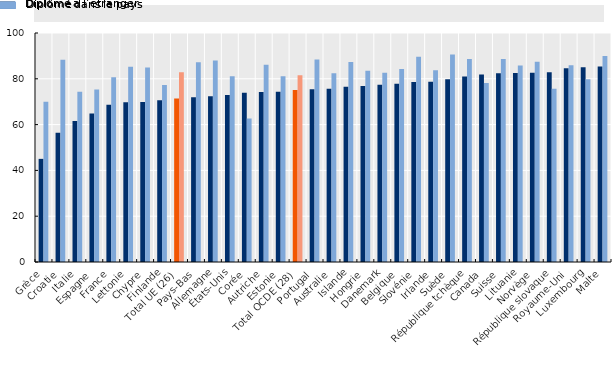
| Category | Diplômé à l’étranger | Diplômé dans le pays |
|---|---|---|
| Grèce | 45.035 | 69.969 |
| Croatie | 56.391 | 88.297 |
| Italie | 61.547 | 74.314 |
| Espagne | 64.878 | 75.319 |
| France | 68.668 | 80.681 |
| Lettonie | 69.769 | 85.293 |
| Chypre | 69.894 | 84.911 |
| Finlande | 70.635 | 77.281 |
| Total UE (26) | 71.386 | 82.904 |
| Pays-Bas | 71.936 | 87.249 |
| Allemagne | 72.423 | 88.001 |
| États-Unis | 72.979 | 81.158 |
| Corée | 73.948 | 62.646 |
| Autriche | 74.236 | 86.153 |
| Estonie | 74.328 | 81.088 |
| Total OCDE (28) | 75.097 | 81.602 |
| Portugal | 75.449 | 88.446 |
| Australie | 75.654 | 82.453 |
| Islande | 76.561 | 87.294 |
| Hongrie | 76.812 | 83.475 |
| Danemark | 77.45 | 82.692 |
| Belgique | 77.84 | 84.308 |
| Slovénie | 78.59 | 89.67 |
| Irlande | 78.76 | 83.764 |
| Suède | 79.828 | 90.595 |
| République tchèque | 80.99 | 88.618 |
| Canada | 81.927 | 78.174 |
| Suisse | 82.413 | 88.672 |
| Lituanie | 82.481 | 85.807 |
| Norvège | 82.625 | 87.468 |
| République slovaque | 82.831 | 75.702 |
| Royaume-Uni | 84.63 | 85.888 |
| Luxembourg | 85.053 | 79.75 |
| Malte | 85.415 | 89.948 |